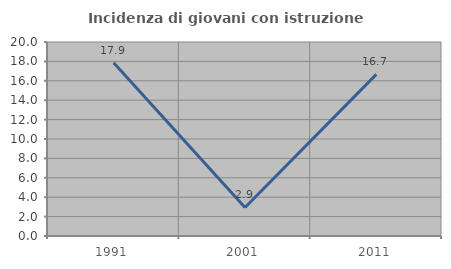
| Category | Incidenza di giovani con istruzione universitaria |
|---|---|
| 1991.0 | 17.857 |
| 2001.0 | 2.941 |
| 2011.0 | 16.667 |